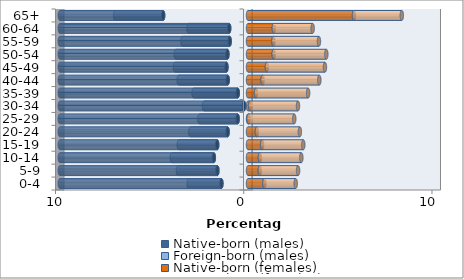
| Category | Native-born (males) | Foreign-born (males) | Native-born (females) | Foreign-born (females) |
|---|---|---|---|---|
| 0-4 | -1.411 | -1.735 | 0.868 | 1.668 |
| 5-9 | -1.626 | -2.096 | 0.627 | 2.033 |
| 10-14 | -1.814 | -2.232 | 0.633 | 2.201 |
| 15-19 | -1.636 | -2.039 | 0.748 | 2.19 |
| 20-24 | -1.082 | -1.981 | 0.47 | 2.284 |
| 25-29 | -0.549 | -2.033 | 0.031 | 2.426 |
| 30-34 | -0.209 | -2.128 | 0.115 | 2.541 |
| 35-39 | -0.544 | -2.347 | 0.423 | 2.771 |
| 40-44 | -1.077 | -2.603 | 0.774 | 3.016 |
| 45-49 | -1.145 | -2.734 | 1.004 | 3.084 |
| 50-54 | -1.093 | -2.744 | 1.364 | 2.797 |
| 55-59 | -0.972 | -2.509 | 1.349 | 2.42 |
| 60-64 | -0.998 | -2.164 | 1.37 | 2.065 |
| 65+ | -4.506 | -2.551 | 5.63 | 2.541 |